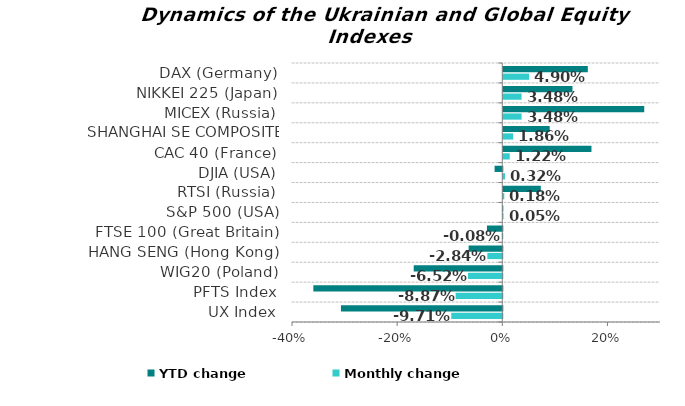
| Category | Monthly change | YTD change |
|---|---|---|
| UX Index | -0.097 | -0.307 |
| PFTS Index | -0.089 | -0.359 |
| WIG20 (Poland) | -0.065 | -0.168 |
| HANG SENG (Hong Kong) | -0.028 | -0.064 |
| FTSE 100 (Great Britain) | -0.001 | -0.029 |
| S&P 500 (USA) | 0.001 | 0 |
| RTSI (Russia) | 0.002 | 0.071 |
| DJIA (USA) | 0.003 | -0.015 |
| CAC 40 (France) | 0.012 | 0.168 |
| SHANGHAI SE COMPOSITE (China) | 0.019 | 0.088 |
| MICEX (Russia) | 0.035 | 0.268 |
| NIKKEI 225 (Japan) | 0.035 | 0.132 |
| DAX (Germany) | 0.049 | 0.161 |